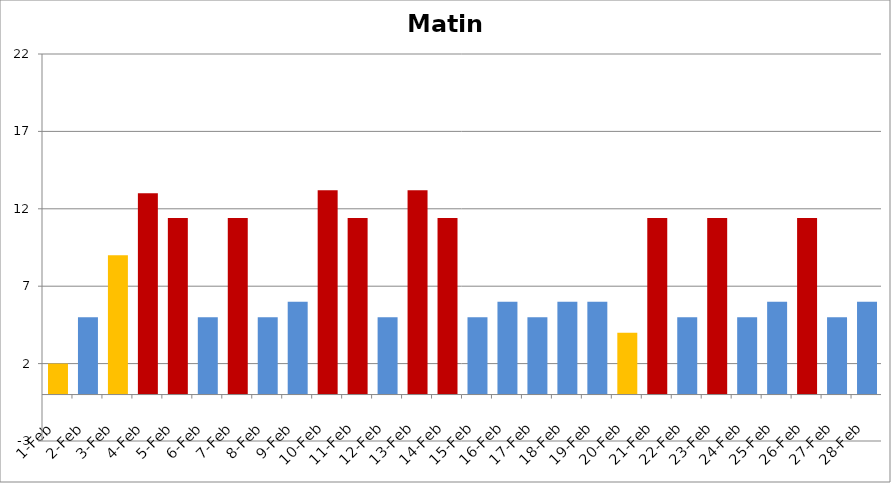
| Category | Series 0 | Series 1 | Series 2 | Series 3 |
|---|---|---|---|---|
| 2013-02-01 | 2 | 0 | 0 | 0 |
| 2013-02-02 | 0 | 5 | 0 | 0 |
| 2013-02-03 | 0 | 0 | 9 | 0 |
| 2013-02-04 | 0 | 0 | 0 | 13 |
| 2013-02-05 | 0 | 0 | 0 | 11.4 |
| 2013-02-06 | 0 | 5 | 0 | 0 |
| 2013-02-07 | 0 | 0 | 0 | 11.4 |
| 2013-02-08 | 0 | 5 | 0 | 0 |
| 2013-02-09 | 0 | 6 | 0 | 0 |
| 2013-02-10 | 0 | 0 | 0 | 13.2 |
| 2013-02-11 | 0 | 0 | 0 | 11.4 |
| 2013-02-12 | 0 | 5 | 0 | 0 |
| 2013-02-13 | 0 | 0 | 0 | 13.2 |
| 2013-02-14 | 0 | 0 | 0 | 11.4 |
| 2013-02-15 | 0 | 5 | 0 | 0 |
| 2013-02-16 | 0 | 6 | 0 | 0 |
| 2013-02-17 | 0 | 5 | 0 | 0 |
| 2013-02-18 | 0 | 6 | 0 | 0 |
| 2013-02-19 | 0 | 6 | 0 | 0 |
| 2013-02-20 | 4 | 0 | 0 | 0 |
| 2013-02-21 | 0 | 0 | 0 | 11.4 |
| 2013-02-22 | 0 | 5 | 0 | 0 |
| 2013-02-23 | 0 | 0 | 0 | 11.4 |
| 2013-02-24 | 0 | 5 | 0 | 0 |
| 2013-02-25 | 0 | 6 | 0 | 0 |
| 2013-02-26 | 0 | 0 | 0 | 11.4 |
| 2013-02-27 | 0 | 5 | 0 | 0 |
| 2013-02-28 | 0 | 6 | 0 | 0 |